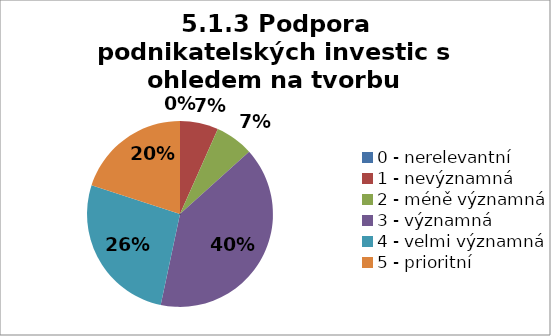
| Category | Series 6 | Series 5 | Series 4 | Series 3 | Series 2 | Series 1 | Series 0 |
|---|---|---|---|---|---|---|---|
| 0 - nerelevantní | 0 | 0 | 6.667 | 0 | 0 | 0 | 0 |
| 1 - nevýznamná | 6.667 | 6.667 | 0 | 0 | 6.667 | 0 | 0 |
| 2 - méně významná | 6.667 | 6.667 | 6.667 | 26.667 | 0 | 6.667 | 0 |
| 3 - významná | 40 | 46.667 | 40 | 46.667 | 53.333 | 46.667 | 33.333 |
| 4 - velmi významná | 26.667 | 33.333 | 26.667 | 13.333 | 40 | 33.333 | 40 |
| 5 - prioritní | 20 | 6.667 | 20 | 13.333 | 0 | 13.333 | 26.667 |